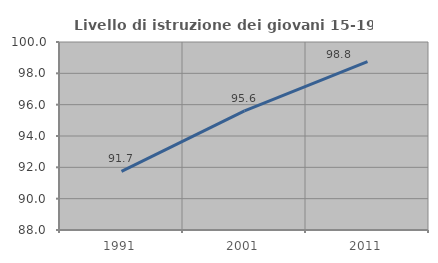
| Category | Livello di istruzione dei giovani 15-19 anni |
|---|---|
| 1991.0 | 91.743 |
| 2001.0 | 95.604 |
| 2011.0 | 98.75 |